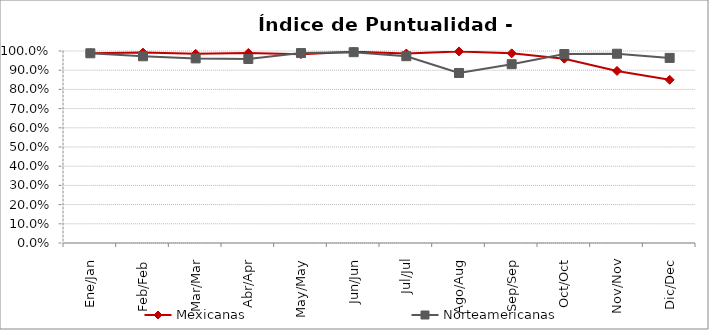
| Category | Mexicanas | Norteamericanas |
|---|---|---|
| Ene/Jan | 0.989 | 0.988 |
| Feb/Feb | 0.992 | 0.973 |
| Mar/Mar | 0.985 | 0.961 |
| Abr/Apr | 0.99 | 0.959 |
| May/May | 0.984 | 0.989 |
| Jun/Jun | 0.997 | 0.994 |
| Jul/Jul | 0.987 | 0.973 |
| Ago/Aug | 0.998 | 0.885 |
| Sep/Sep | 0.988 | 0.931 |
| Oct/Oct | 0.96 | 0.984 |
| Nov/Nov | 0.896 | 0.986 |
| Dic/Dec | 0.85 | 0.964 |